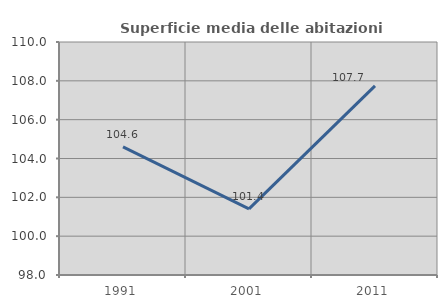
| Category | Superficie media delle abitazioni occupate |
|---|---|
| 1991.0 | 104.6 |
| 2001.0 | 101.407 |
| 2011.0 | 107.738 |